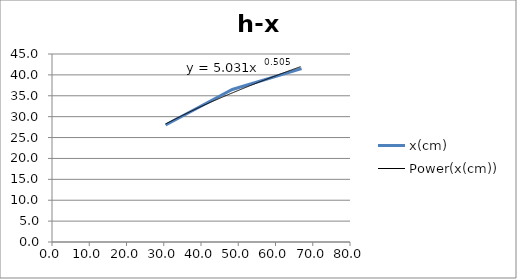
| Category | x(cm) |
|---|---|
| 30.5 | 28 |
| 48.4 | 36.5 |
| 67.0 | 41.5 |